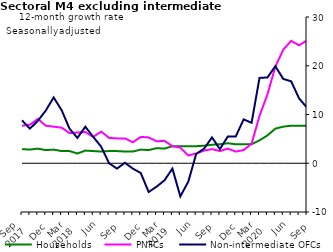
| Category | zero | Households | PNFCs | Non-intermediate OFCs |
|---|---|---|---|---|
| Sep 
2017 | 0 | 2.9 | 7.7 | 8.8 |
|  | 0 | 2.8 | 7.9 | 7.1 |
|  | 0 | 3 | 9.1 | 8.7 |
| Dec | 0 | 2.7 | 7.7 | 10.8 |
|  | 0 | 2.8 | 7.5 | 13.5 |
|  | 0 | 2.5 | 7.3 | 10.9 |
| Mar 
2018 | 0 | 2.5 | 6.2 | 7.1 |
|  | 0 | 2 | 6.3 | 5.2 |
|  | 0 | 2.6 | 6.4 | 7.5 |
| Jun | 0 | 2.5 | 5.4 | 5.4 |
|  | 0 | 2.4 | 6.5 | 3.4 |
|  | 0 | 2.5 | 5.2 | 0 |
| Sep | 0 | 2.5 | 5.1 | -1.1 |
|  | 0 | 2.4 | 5.1 | 0.1 |
|  | 0 | 2.4 | 4.3 | -1.1 |
| Dec | 0 | 2.8 | 5.4 | -2 |
|  | 0 | 2.7 | 5.3 | -5.9 |
|  | 0 | 3.1 | 4.5 | -4.8 |
| Mar 
2019 | 0 | 3 | 4.6 | -3.5 |
|  | 0 | 3.5 | 3.5 | -1.1 |
|  | 0 | 3.5 | 3.2 | -6.8 |
| Jun | 0 | 3.5 | 1.6 | -3.8 |
|  | 0 | 3.5 | 2 | 1.9 |
|  | 0 | 3.6 | 2.6 | 3 |
| Sep | 0 | 3.8 | 2.9 | 5.3 |
|  | 0 | 3.9 | 2.5 | 2.9 |
|  | 0 | 4.1 | 3 | 5.5 |
| Dec | 0 | 3.9 | 2.4 | 5.5 |
|  | 0 | 3.9 | 2.7 | 9 |
|  | 0 | 3.9 | 4 | 8.3 |
| Mar 
2020 | 0 | 4.7 | 9.7 | 17.5 |
|  | 0 | 5.7 | 14.1 | 17.6 |
|  | 0 | 7.1 | 19.8 | 19.9 |
| Jun | 0 | 7.5 | 23.3 | 17.3 |
|  | 0 | 7.7 | 25.1 | 16.8 |
|  | 0 | 7.7 | 24.2 | 13.3 |
| Sep | 0 | 7.7 | 25.2 | 11.4 |